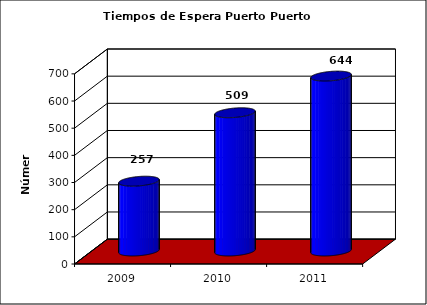
| Category | Series 0 |
|---|---|
| 2009.0 | 257 |
| 2010.0 | 509 |
| 2011.0 | 643.93 |